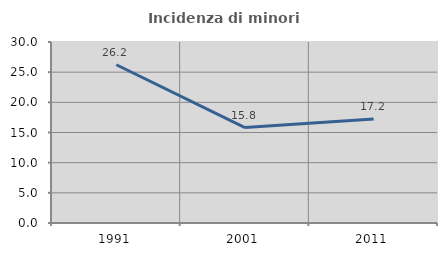
| Category | Incidenza di minori stranieri |
|---|---|
| 1991.0 | 26.23 |
| 2001.0 | 15.823 |
| 2011.0 | 17.241 |